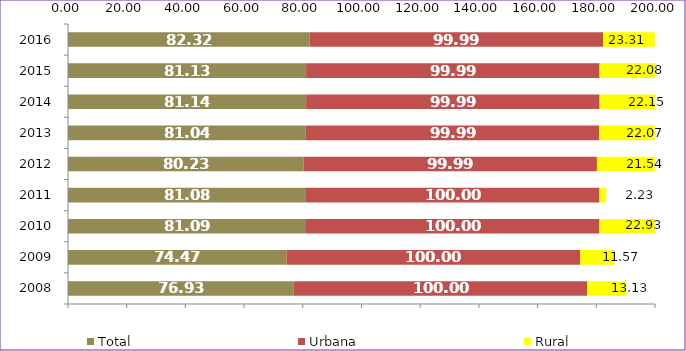
| Category | Total | Urbana | Rural |
|---|---|---|---|
| 2008.0 | 76.93 | 100 | 13.13 |
| 2009.0 | 74.47 | 100 | 11.57 |
| 2010.0 | 81.09 | 100 | 22.93 |
| 2011.0 | 81.08 | 100 | 2.23 |
| 2012.0 | 80.23 | 99.99 | 21.54 |
| 2013.0 | 81.04 | 99.99 | 22.07 |
| 2014.0 | 81.14 | 99.99 | 22.15 |
| 2015.0 | 81.13 | 99.99 | 22.08 |
| 2016.0 | 82.32 | 99.99 | 23.31 |